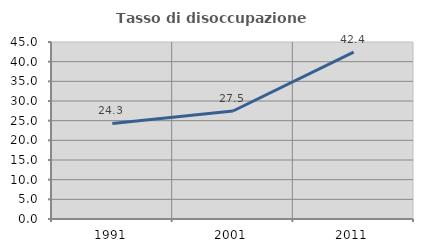
| Category | Tasso di disoccupazione giovanile  |
|---|---|
| 1991.0 | 24.286 |
| 2001.0 | 27.451 |
| 2011.0 | 42.424 |